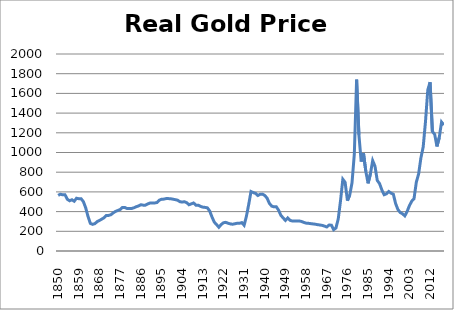
| Category | Series 0 |
|---|---|
| 1850 | 564.365 |
| 1851 | 576.605 |
| 1852 | 570.42 |
| 1853 | 570.42 |
| 1854 | 525.21 |
| 1855 | 510.094 |
| 1856 | 520.073 |
| 1857 | 505.247 |
| 1858 | 535.859 |
| 1859 | 530.513 |
| 1860 | 530.513 |
| 1861 | 500.435 |
| 1862 | 438.396 |
| 1863 | 351.324 |
| 1864 | 280.675 |
| 1865 | 270.657 |
| 1866 | 277.743 |
| 1867 | 298.017 |
| 1868 | 310.23 |
| 1869 | 323.464 |
| 1870 | 337.876 |
| 1871 | 360.862 |
| 1872 | 361.052 |
| 1873 | 368.587 |
| 1874 | 387.407 |
| 1875 | 402.082 |
| 1876 | 411.449 |
| 1877 | 421.222 |
| 1878 | 442.319 |
| 1879 | 442.319 |
| 1880 | 431.513 |
| 1881 | 431.513 |
| 1882 | 431.513 |
| 1883 | 438.628 |
| 1884 | 449.798 |
| 1885 | 457.535 |
| 1886 | 469.702 |
| 1887 | 465.591 |
| 1888 | 465.591 |
| 1889 | 477.892 |
| 1890 | 486.951 |
| 1891 | 487.465 |
| 1892 | 487.465 |
| 1893 | 491.968 |
| 1894 | 515.307 |
| 1895 | 525.21 |
| 1896 | 526.597 |
| 1897 | 531.914 |
| 1898 | 531.914 |
| 1899 | 530.793 |
| 1900 | 526.042 |
| 1901 | 521.446 |
| 1902 | 516.123 |
| 1903 | 500.964 |
| 1904 | 496.555 |
| 1905 | 500.171 |
| 1906 | 490.411 |
| 1907 | 469.702 |
| 1908 | 478.397 |
| 1909 | 487.465 |
| 1910 | 465.1 |
| 1911 | 465.1 |
| 1912 | 453.394 |
| 1913 | 445.556 |
| 1914 | 442.732 |
| 1915 | 438.349 |
| 1916 | 406.177 |
| 1917 | 345.885 |
| 1918 | 293.2 |
| 1919 | 268.852 |
| 1920 | 241.067 |
| 1921 | 268.046 |
| 1922 | 286.706 |
| 1923 | 290.675 |
| 1924 | 282.086 |
| 1925 | 274.972 |
| 1926 | 271.733 |
| 1927 | 276.552 |
| 1928 | 281.677 |
| 1929 | 281.267 |
| 1930 | 288.284 |
| 1931 | 261.669 |
| 1932 | 352.092 |
| 1933 | 472.198 |
| 1934 | 603.554 |
| 1935 | 592.89 |
| 1936 | 584.862 |
| 1937 | 563.259 |
| 1938 | 576.236 |
| 1939 | 577.315 |
| 1940 | 563.699 |
| 1941 | 536.856 |
| 1942 | 484.158 |
| 1943 | 456.172 |
| 1944 | 448.397 |
| 1945 | 449.571 |
| 1946 | 414.989 |
| 1947 | 362.883 |
| 1948 | 335.779 |
| 1949 | 310.429 |
| 1950 | 335.876 |
| 1951 | 311.331 |
| 1952 | 304.401 |
| 1953 | 304.217 |
| 1954 | 303.688 |
| 1955 | 304.735 |
| 1956 | 299.91 |
| 1957 | 289.973 |
| 1958 | 283.156 |
| 1959 | 281.21 |
| 1960 | 277.799 |
| 1961 | 274.855 |
| 1962 | 271.971 |
| 1963 | 267.349 |
| 1964 | 263.974 |
| 1965 | 259.932 |
| 1966 | 252.784 |
| 1967 | 243.959 |
| 1968 | 263.354 |
| 1969 | 262.235 |
| 1970 | 216.435 |
| 1971 | 233.831 |
| 1972 | 325.838 |
| 1973 | 511.385 |
| 1974 | 728.266 |
| 1975 | 697.079 |
| 1976 | 511.105 |
| 1977 | 568.769 |
| 1978 | 691.553 |
| 1979 | 982.655 |
| 1980 | 1740.06 |
| 1981 | 1179.805 |
| 1982 | 908.4 |
| 1983 | 992.483 |
| 1984 | 810.043 |
| 1985 | 686.852 |
| 1986 | 782.805 |
| 1987 | 917.372 |
| 1988 | 861.218 |
| 1989 | 716.341 |
| 1990 | 684.097 |
| 1991 | 619.84 |
| 1992 | 571.334 |
| 1993 | 580.462 |
| 1994 | 604.087 |
| 1995 | 587.118 |
| 1996 | 576.252 |
| 1997 | 480.835 |
| 1998 | 420.853 |
| 1999 | 390.404 |
| 2000 | 377.884 |
| 2001 | 356.805 |
| 2002 | 401.392 |
| 2003 | 460.426 |
| 2004 | 505.651 |
| 2005 | 530.93 |
| 2006 | 697.95 |
| 2007 | 781.836 |
| 2008 | 944.32 |
| 2009 | 1056.464 |
| 2010 | 1311.87 |
| 2011 | 1635.169 |
| 2012 | 1713.374 |
| 2013 | 1214.771 |
| 2014 | 1184.86 |
| 2015 | 1061.42 |
| 2016 | 1152.27 |
| 2017 | 1308.7 |
| 2018 | 1279 |